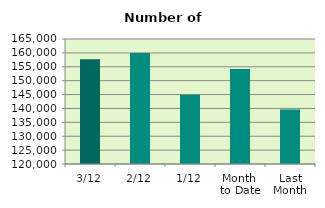
| Category | Series 0 |
|---|---|
| 3/12 | 157702 |
| 2/12 | 159992 |
| 1/12 | 144916 |
| Month 
to Date | 154203.333 |
| Last
Month | 139642.182 |